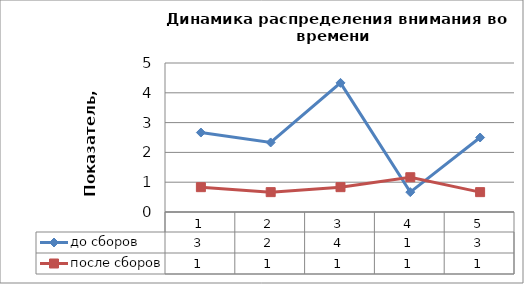
| Category | до сборов | после сборов |
|---|---|---|
| 0 | 2.667 | 0.833 |
| 1 | 2.333 | 0.667 |
| 2 | 4.333 | 0.833 |
| 3 | 0.667 | 1.167 |
| 4 | 2.5 | 0.667 |